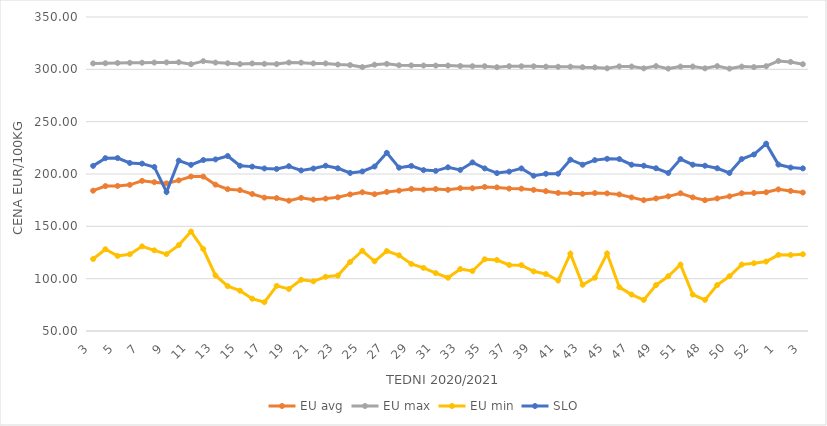
| Category | EU avg | EU max | EU min | SLO |
|---|---|---|---|---|
| 3.0 | 184.051 | 305.65 | 118.776 | 207.76 |
| 4.0 | 188.425 | 305.81 | 128.1 | 215.13 |
| 5.0 | 188.576 | 306.05 | 121.738 | 215.22 |
| 6.0 | 189.621 | 306.25 | 123.326 | 210.53 |
| 7.0 | 193.453 | 306.33 | 130.863 | 209.91 |
| 8.0 | 192.201 | 306.48 | 127.071 | 206.73 |
| 9.0 | 191.052 | 306.62 | 123.433 | 182.84 |
| 10.0 | 193.933 | 306.73 | 132.064 | 212.78 |
| 11.0 | 197.552 | 304.92 | 145.006 | 208.73 |
| 12.0 | 197.533 | 307.82 | 128.293 | 213.32 |
| 13.0 | 189.839 | 306.44 | 103.04 | 213.96 |
| 14.0 | 185.504 | 305.8 | 92.836 | 217.19 |
| 15.0 | 184.591 | 305.08 | 88.508 | 207.87 |
| 16.0 | 180.892 | 305.63 | 80.873 | 207.05 |
| 17.0 | 177.437 | 305.27 | 77.506 | 205.29 |
| 18.0 | 176.995 | 305.01 | 93.104 | 204.82 |
| 19.0 | 174.49 | 306.49 | 90.169 | 207.44 |
| 20.0 | 177.204 | 306.38 | 98.928 | 203.41 |
| 21.0 | 175.519 | 305.66 | 97.454 | 205.19 |
| 22.0 | 176.473 | 305.64 | 101.792 | 207.91 |
| 23.0 | 177.741 | 304.59 | 102.918 | 205.46 |
| 24.0 | 180.501 | 304.1 | 115.936 | 201 |
| 25.0 | 182.568 | 302.13 | 126.655 | 202.43 |
| 26.0 | 180.667 | 304.43 | 116.597 | 207.19 |
| 27.0 | 182.833 | 305.22 | 126.397 | 220.25 |
| 28.0 | 184.121 | 303.88 | 122.317 | 206.06 |
| 29.0 | 185.712 | 303.73 | 114.082 | 207.73 |
| 30.0 | 185.141 | 303.63 | 110.314 | 203.73 |
| 31.0 | 185.621 | 303.57 | 105.336 | 203 |
| 32.0 | 184.887 | 303.58 | 100.908 | 206.36 |
| 33.0 | 186.411 | 303.17 | 109.191 | 203.88 |
| 34.0 | 186.338 | 302.96 | 107.355 | 211.07 |
| 35.0 | 187.628 | 302.99 | 118.534 | 205.34 |
| 36.0 | 187.19 | 302.05 | 117.814 | 200.88 |
| 37.0 | 186.038 | 302.98 | 113.058 | 202.29 |
| 38.0 | 185.986 | 302.94 | 112.896 | 205.33 |
| 39.0 | 184.836 | 302.88 | 106.953 | 198.33 |
| 40.0 | 183.595 | 302.56 | 104.426 | 200.21 |
| 41.0 | 181.893 | 302.44 | 98.23 | 200.3 |
| 42.0 | 181.671 | 302.52 | 123.908 | 213.66 |
| 43.0 | 181.023 | 302.01 | 94.177 | 208.86 |
| 44.0 | 181.795 | 301.86 | 100.908 | 213.25 |
| 45.0 | 181.489 | 300.98 | 124 | 214.51 |
| 46.0 | 180.473 | 302.82 | 91.889 | 214.27 |
| 47.0 | 177.656 | 302.7 | 84.832 | 208.87 |
| 48.0 | 174.977 | 300.94 | 79.697 | 207.9 |
| 49.0 | 176.65 | 303.09 | 93.873 | 205.48 |
| 50.0 | 178.648 | 300.7 | 102.316 | 200.99 |
| 51.0 | 181.58 | 302.62 | 113.46 | 214.25 |
| 47.0 | 177.656 | 302.7 | 84.832 | 208.87 |
| 48.0 | 174.977 | 300.94 | 79.697 | 207.9 |
| 49.0 | 176.65 | 303.09 | 93.873 | 205.48 |
| 50.0 | 178.648 | 300.7 | 102.316 | 200.99 |
| 51.0 | 181.58 | 302.62 | 113.46 | 214.25 |
| 52.0 | 181.9 | 302.14 | 114.76 | 218.61 |
| 53.0 | 182.536 | 303 | 116.375 | 229 |
| 1.0 | 185.3 | 308 | 122.769 | 209 |
| 2.0 | 183.813 | 307.1 | 122.609 | 206.15 |
| 3.0 | 182.27 | 304.91 | 123.32 | 205.35 |